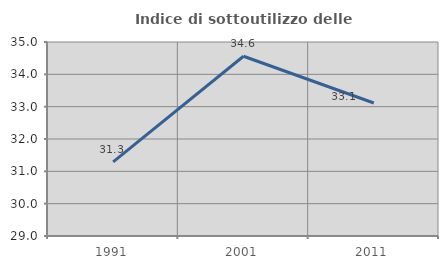
| Category | Indice di sottoutilizzo delle abitazioni  |
|---|---|
| 1991.0 | 31.293 |
| 2001.0 | 34.559 |
| 2011.0 | 33.113 |